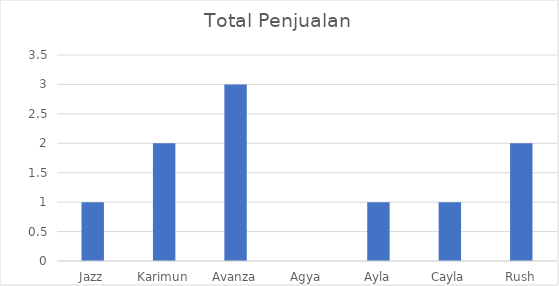
| Category | Total Penjualan |
|---|---|
| Jazz | 1 |
| Karimun | 2 |
| Avanza | 3 |
| Agya | 0 |
| Ayla | 1 |
| Cayla | 1 |
| Rush | 2 |